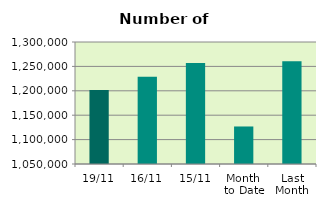
| Category | Series 0 |
|---|---|
| 19/11 | 1201486 |
| 16/11 | 1228760 |
| 15/11 | 1257140 |
| Month 
to Date | 1126882.769 |
| Last
Month | 1260789.391 |